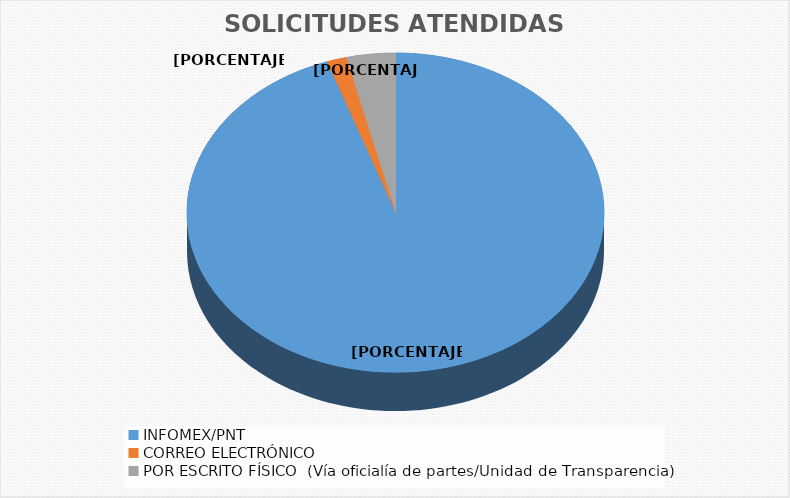
| Category | Series 0 |
|---|---|
| INFOMEX/PNT | 3217 |
| CORREO ELECTRÓNICO | 52 |
| POR ESCRITO FÍSICO  (Vía oficialía de partes/Unidad de Transparencia) | 129 |